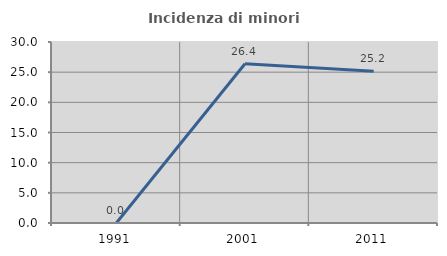
| Category | Incidenza di minori stranieri |
|---|---|
| 1991.0 | 0 |
| 2001.0 | 26.389 |
| 2011.0 | 25.157 |